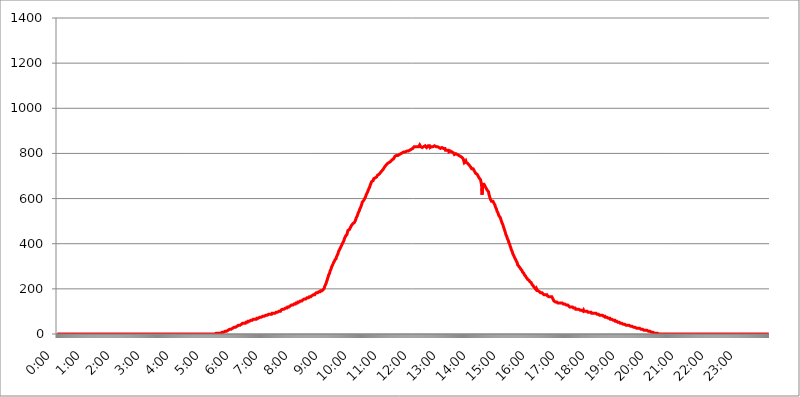
| Category | 2017.08.01. Intenzitás [W/m^2] |
|---|---|
| 0.0 | 0 |
| 0.0006944444444444445 | 0 |
| 0.001388888888888889 | 0 |
| 0.0020833333333333333 | 0 |
| 0.002777777777777778 | 0 |
| 0.003472222222222222 | 0 |
| 0.004166666666666667 | 0 |
| 0.004861111111111111 | 0 |
| 0.005555555555555556 | 0 |
| 0.0062499999999999995 | 0 |
| 0.006944444444444444 | 0 |
| 0.007638888888888889 | 0 |
| 0.008333333333333333 | 0 |
| 0.009027777777777779 | 0 |
| 0.009722222222222222 | 0 |
| 0.010416666666666666 | 0 |
| 0.011111111111111112 | 0 |
| 0.011805555555555555 | 0 |
| 0.012499999999999999 | 0 |
| 0.013194444444444444 | 0 |
| 0.013888888888888888 | 0 |
| 0.014583333333333332 | 0 |
| 0.015277777777777777 | 0 |
| 0.015972222222222224 | 0 |
| 0.016666666666666666 | 0 |
| 0.017361111111111112 | 0 |
| 0.018055555555555557 | 0 |
| 0.01875 | 0 |
| 0.019444444444444445 | 0 |
| 0.02013888888888889 | 0 |
| 0.020833333333333332 | 0 |
| 0.02152777777777778 | 0 |
| 0.022222222222222223 | 0 |
| 0.02291666666666667 | 0 |
| 0.02361111111111111 | 0 |
| 0.024305555555555556 | 0 |
| 0.024999999999999998 | 0 |
| 0.025694444444444447 | 0 |
| 0.02638888888888889 | 0 |
| 0.027083333333333334 | 0 |
| 0.027777777777777776 | 0 |
| 0.02847222222222222 | 0 |
| 0.029166666666666664 | 0 |
| 0.029861111111111113 | 0 |
| 0.030555555555555555 | 0 |
| 0.03125 | 0 |
| 0.03194444444444445 | 0 |
| 0.03263888888888889 | 0 |
| 0.03333333333333333 | 0 |
| 0.034027777777777775 | 0 |
| 0.034722222222222224 | 0 |
| 0.035416666666666666 | 0 |
| 0.036111111111111115 | 0 |
| 0.03680555555555556 | 0 |
| 0.0375 | 0 |
| 0.03819444444444444 | 0 |
| 0.03888888888888889 | 0 |
| 0.03958333333333333 | 0 |
| 0.04027777777777778 | 0 |
| 0.04097222222222222 | 0 |
| 0.041666666666666664 | 0 |
| 0.042361111111111106 | 0 |
| 0.04305555555555556 | 0 |
| 0.043750000000000004 | 0 |
| 0.044444444444444446 | 0 |
| 0.04513888888888889 | 0 |
| 0.04583333333333334 | 0 |
| 0.04652777777777778 | 0 |
| 0.04722222222222222 | 0 |
| 0.04791666666666666 | 0 |
| 0.04861111111111111 | 0 |
| 0.049305555555555554 | 0 |
| 0.049999999999999996 | 0 |
| 0.05069444444444445 | 0 |
| 0.051388888888888894 | 0 |
| 0.052083333333333336 | 0 |
| 0.05277777777777778 | 0 |
| 0.05347222222222222 | 0 |
| 0.05416666666666667 | 0 |
| 0.05486111111111111 | 0 |
| 0.05555555555555555 | 0 |
| 0.05625 | 0 |
| 0.05694444444444444 | 0 |
| 0.057638888888888885 | 0 |
| 0.05833333333333333 | 0 |
| 0.05902777777777778 | 0 |
| 0.059722222222222225 | 0 |
| 0.06041666666666667 | 0 |
| 0.061111111111111116 | 0 |
| 0.06180555555555556 | 0 |
| 0.0625 | 0 |
| 0.06319444444444444 | 0 |
| 0.06388888888888888 | 0 |
| 0.06458333333333334 | 0 |
| 0.06527777777777778 | 0 |
| 0.06597222222222222 | 0 |
| 0.06666666666666667 | 0 |
| 0.06736111111111111 | 0 |
| 0.06805555555555555 | 0 |
| 0.06874999999999999 | 0 |
| 0.06944444444444443 | 0 |
| 0.07013888888888889 | 0 |
| 0.07083333333333333 | 0 |
| 0.07152777777777779 | 0 |
| 0.07222222222222223 | 0 |
| 0.07291666666666667 | 0 |
| 0.07361111111111111 | 0 |
| 0.07430555555555556 | 0 |
| 0.075 | 0 |
| 0.07569444444444444 | 0 |
| 0.0763888888888889 | 0 |
| 0.07708333333333334 | 0 |
| 0.07777777777777778 | 0 |
| 0.07847222222222222 | 0 |
| 0.07916666666666666 | 0 |
| 0.0798611111111111 | 0 |
| 0.08055555555555556 | 0 |
| 0.08125 | 0 |
| 0.08194444444444444 | 0 |
| 0.08263888888888889 | 0 |
| 0.08333333333333333 | 0 |
| 0.08402777777777777 | 0 |
| 0.08472222222222221 | 0 |
| 0.08541666666666665 | 0 |
| 0.08611111111111112 | 0 |
| 0.08680555555555557 | 0 |
| 0.08750000000000001 | 0 |
| 0.08819444444444445 | 0 |
| 0.08888888888888889 | 0 |
| 0.08958333333333333 | 0 |
| 0.09027777777777778 | 0 |
| 0.09097222222222222 | 0 |
| 0.09166666666666667 | 0 |
| 0.09236111111111112 | 0 |
| 0.09305555555555556 | 0 |
| 0.09375 | 0 |
| 0.09444444444444444 | 0 |
| 0.09513888888888888 | 0 |
| 0.09583333333333333 | 0 |
| 0.09652777777777777 | 0 |
| 0.09722222222222222 | 0 |
| 0.09791666666666667 | 0 |
| 0.09861111111111111 | 0 |
| 0.09930555555555555 | 0 |
| 0.09999999999999999 | 0 |
| 0.10069444444444443 | 0 |
| 0.1013888888888889 | 0 |
| 0.10208333333333335 | 0 |
| 0.10277777777777779 | 0 |
| 0.10347222222222223 | 0 |
| 0.10416666666666667 | 0 |
| 0.10486111111111111 | 0 |
| 0.10555555555555556 | 0 |
| 0.10625 | 0 |
| 0.10694444444444444 | 0 |
| 0.1076388888888889 | 0 |
| 0.10833333333333334 | 0 |
| 0.10902777777777778 | 0 |
| 0.10972222222222222 | 0 |
| 0.1111111111111111 | 0 |
| 0.11180555555555556 | 0 |
| 0.11180555555555556 | 0 |
| 0.1125 | 0 |
| 0.11319444444444444 | 0 |
| 0.11388888888888889 | 0 |
| 0.11458333333333333 | 0 |
| 0.11527777777777777 | 0 |
| 0.11597222222222221 | 0 |
| 0.11666666666666665 | 0 |
| 0.1173611111111111 | 0 |
| 0.11805555555555557 | 0 |
| 0.11944444444444445 | 0 |
| 0.12013888888888889 | 0 |
| 0.12083333333333333 | 0 |
| 0.12152777777777778 | 0 |
| 0.12222222222222223 | 0 |
| 0.12291666666666667 | 0 |
| 0.12291666666666667 | 0 |
| 0.12361111111111112 | 0 |
| 0.12430555555555556 | 0 |
| 0.125 | 0 |
| 0.12569444444444444 | 0 |
| 0.12638888888888888 | 0 |
| 0.12708333333333333 | 0 |
| 0.16875 | 0 |
| 0.12847222222222224 | 0 |
| 0.12916666666666668 | 0 |
| 0.12986111111111112 | 0 |
| 0.13055555555555556 | 0 |
| 0.13125 | 0 |
| 0.13194444444444445 | 0 |
| 0.1326388888888889 | 0 |
| 0.13333333333333333 | 0 |
| 0.13402777777777777 | 0 |
| 0.13402777777777777 | 0 |
| 0.13472222222222222 | 0 |
| 0.13541666666666666 | 0 |
| 0.1361111111111111 | 0 |
| 0.13749999999999998 | 0 |
| 0.13819444444444443 | 0 |
| 0.1388888888888889 | 0 |
| 0.13958333333333334 | 0 |
| 0.14027777777777778 | 0 |
| 0.14097222222222222 | 0 |
| 0.14166666666666666 | 0 |
| 0.1423611111111111 | 0 |
| 0.14305555555555557 | 0 |
| 0.14375000000000002 | 0 |
| 0.14444444444444446 | 0 |
| 0.1451388888888889 | 0 |
| 0.1451388888888889 | 0 |
| 0.14652777777777778 | 0 |
| 0.14722222222222223 | 0 |
| 0.14791666666666667 | 0 |
| 0.1486111111111111 | 0 |
| 0.14930555555555555 | 0 |
| 0.15 | 0 |
| 0.15069444444444444 | 0 |
| 0.15138888888888888 | 0 |
| 0.15208333333333332 | 0 |
| 0.15277777777777776 | 0 |
| 0.15347222222222223 | 0 |
| 0.15416666666666667 | 0 |
| 0.15486111111111112 | 0 |
| 0.15555555555555556 | 0 |
| 0.15625 | 0 |
| 0.15694444444444444 | 0 |
| 0.15763888888888888 | 0 |
| 0.15833333333333333 | 0 |
| 0.15902777777777777 | 0 |
| 0.15972222222222224 | 0 |
| 0.16041666666666668 | 0 |
| 0.16111111111111112 | 0 |
| 0.16180555555555556 | 0 |
| 0.1625 | 0 |
| 0.16319444444444445 | 0 |
| 0.1638888888888889 | 0 |
| 0.16458333333333333 | 0 |
| 0.16527777777777777 | 0 |
| 0.16597222222222222 | 0 |
| 0.16666666666666666 | 0 |
| 0.1673611111111111 | 0 |
| 0.16805555555555554 | 0 |
| 0.16874999999999998 | 0 |
| 0.16944444444444443 | 0 |
| 0.17013888888888887 | 0 |
| 0.1708333333333333 | 0 |
| 0.17152777777777775 | 0 |
| 0.17222222222222225 | 0 |
| 0.1729166666666667 | 0 |
| 0.17361111111111113 | 0 |
| 0.17430555555555557 | 0 |
| 0.17500000000000002 | 0 |
| 0.17569444444444446 | 0 |
| 0.1763888888888889 | 0 |
| 0.17708333333333334 | 0 |
| 0.17777777777777778 | 0 |
| 0.17847222222222223 | 0 |
| 0.17916666666666667 | 0 |
| 0.1798611111111111 | 0 |
| 0.18055555555555555 | 0 |
| 0.18125 | 0 |
| 0.18194444444444444 | 0 |
| 0.1826388888888889 | 0 |
| 0.18333333333333335 | 0 |
| 0.1840277777777778 | 0 |
| 0.18472222222222223 | 0 |
| 0.18541666666666667 | 0 |
| 0.18611111111111112 | 0 |
| 0.18680555555555556 | 0 |
| 0.1875 | 0 |
| 0.18819444444444444 | 0 |
| 0.18888888888888888 | 0 |
| 0.18958333333333333 | 0 |
| 0.19027777777777777 | 0 |
| 0.1909722222222222 | 0 |
| 0.19166666666666665 | 0 |
| 0.19236111111111112 | 0 |
| 0.19305555555555554 | 0 |
| 0.19375 | 0 |
| 0.19444444444444445 | 0 |
| 0.1951388888888889 | 0 |
| 0.19583333333333333 | 0 |
| 0.19652777777777777 | 0 |
| 0.19722222222222222 | 0 |
| 0.19791666666666666 | 0 |
| 0.1986111111111111 | 0 |
| 0.19930555555555554 | 0 |
| 0.19999999999999998 | 0 |
| 0.20069444444444443 | 0 |
| 0.20138888888888887 | 0 |
| 0.2020833333333333 | 0 |
| 0.2027777777777778 | 0 |
| 0.2034722222222222 | 0 |
| 0.2041666666666667 | 0 |
| 0.20486111111111113 | 0 |
| 0.20555555555555557 | 0 |
| 0.20625000000000002 | 0 |
| 0.20694444444444446 | 0 |
| 0.2076388888888889 | 0 |
| 0.20833333333333334 | 0 |
| 0.20902777777777778 | 0 |
| 0.20972222222222223 | 0 |
| 0.21041666666666667 | 0 |
| 0.2111111111111111 | 0 |
| 0.21180555555555555 | 0 |
| 0.2125 | 0 |
| 0.21319444444444444 | 0 |
| 0.2138888888888889 | 0 |
| 0.21458333333333335 | 0 |
| 0.2152777777777778 | 0 |
| 0.21597222222222223 | 0 |
| 0.21666666666666667 | 0 |
| 0.21736111111111112 | 0 |
| 0.21805555555555556 | 0 |
| 0.21875 | 0 |
| 0.21944444444444444 | 0 |
| 0.22013888888888888 | 0 |
| 0.22083333333333333 | 0 |
| 0.22152777777777777 | 0 |
| 0.2222222222222222 | 0 |
| 0.22291666666666665 | 3.525 |
| 0.2236111111111111 | 3.525 |
| 0.22430555555555556 | 3.525 |
| 0.225 | 3.525 |
| 0.22569444444444445 | 3.525 |
| 0.2263888888888889 | 3.525 |
| 0.22708333333333333 | 3.525 |
| 0.22777777777777777 | 3.525 |
| 0.22847222222222222 | 3.525 |
| 0.22916666666666666 | 3.525 |
| 0.2298611111111111 | 3.525 |
| 0.23055555555555554 | 3.525 |
| 0.23124999999999998 | 7.887 |
| 0.23194444444444443 | 7.887 |
| 0.23263888888888887 | 7.887 |
| 0.2333333333333333 | 7.887 |
| 0.2340277777777778 | 7.887 |
| 0.2347222222222222 | 12.257 |
| 0.2354166666666667 | 12.257 |
| 0.23611111111111113 | 12.257 |
| 0.23680555555555557 | 12.257 |
| 0.23750000000000002 | 12.257 |
| 0.23819444444444446 | 12.257 |
| 0.2388888888888889 | 16.636 |
| 0.23958333333333334 | 16.636 |
| 0.24027777777777778 | 16.636 |
| 0.24097222222222223 | 21.024 |
| 0.24166666666666667 | 21.024 |
| 0.2423611111111111 | 21.024 |
| 0.24305555555555555 | 21.024 |
| 0.24375 | 21.024 |
| 0.24444444444444446 | 25.419 |
| 0.24513888888888888 | 25.419 |
| 0.24583333333333335 | 25.419 |
| 0.2465277777777778 | 25.419 |
| 0.24722222222222223 | 25.419 |
| 0.24791666666666667 | 29.823 |
| 0.24861111111111112 | 29.823 |
| 0.24930555555555556 | 29.823 |
| 0.25 | 29.823 |
| 0.25069444444444444 | 29.823 |
| 0.2513888888888889 | 34.234 |
| 0.2520833333333333 | 34.234 |
| 0.25277777777777777 | 34.234 |
| 0.2534722222222222 | 34.234 |
| 0.25416666666666665 | 38.653 |
| 0.2548611111111111 | 38.653 |
| 0.2555555555555556 | 38.653 |
| 0.25625000000000003 | 38.653 |
| 0.2569444444444445 | 43.079 |
| 0.2576388888888889 | 43.079 |
| 0.25833333333333336 | 43.079 |
| 0.2590277777777778 | 43.079 |
| 0.25972222222222224 | 47.511 |
| 0.2604166666666667 | 47.511 |
| 0.2611111111111111 | 47.511 |
| 0.26180555555555557 | 47.511 |
| 0.2625 | 47.511 |
| 0.26319444444444445 | 47.511 |
| 0.2638888888888889 | 47.511 |
| 0.26458333333333334 | 51.951 |
| 0.2652777777777778 | 51.951 |
| 0.2659722222222222 | 51.951 |
| 0.26666666666666666 | 51.951 |
| 0.2673611111111111 | 56.398 |
| 0.26805555555555555 | 56.398 |
| 0.26875 | 56.398 |
| 0.26944444444444443 | 56.398 |
| 0.2701388888888889 | 56.398 |
| 0.2708333333333333 | 56.398 |
| 0.27152777777777776 | 60.85 |
| 0.2722222222222222 | 60.85 |
| 0.27291666666666664 | 60.85 |
| 0.2736111111111111 | 60.85 |
| 0.2743055555555555 | 60.85 |
| 0.27499999999999997 | 65.31 |
| 0.27569444444444446 | 65.31 |
| 0.27638888888888885 | 65.31 |
| 0.27708333333333335 | 65.31 |
| 0.2777777777777778 | 65.31 |
| 0.27847222222222223 | 65.31 |
| 0.2791666666666667 | 65.31 |
| 0.2798611111111111 | 69.775 |
| 0.28055555555555556 | 69.775 |
| 0.28125 | 69.775 |
| 0.28194444444444444 | 69.775 |
| 0.2826388888888889 | 69.775 |
| 0.2833333333333333 | 69.775 |
| 0.28402777777777777 | 74.246 |
| 0.2847222222222222 | 74.246 |
| 0.28541666666666665 | 74.246 |
| 0.28611111111111115 | 74.246 |
| 0.28680555555555554 | 74.246 |
| 0.28750000000000003 | 74.246 |
| 0.2881944444444445 | 78.722 |
| 0.2888888888888889 | 78.722 |
| 0.28958333333333336 | 78.722 |
| 0.2902777777777778 | 78.722 |
| 0.29097222222222224 | 78.722 |
| 0.2916666666666667 | 78.722 |
| 0.2923611111111111 | 83.205 |
| 0.29305555555555557 | 83.205 |
| 0.29375 | 83.205 |
| 0.29444444444444445 | 83.205 |
| 0.2951388888888889 | 83.205 |
| 0.29583333333333334 | 83.205 |
| 0.2965277777777778 | 87.692 |
| 0.2972222222222222 | 87.692 |
| 0.29791666666666666 | 87.692 |
| 0.2986111111111111 | 87.692 |
| 0.29930555555555555 | 87.692 |
| 0.3 | 87.692 |
| 0.30069444444444443 | 87.692 |
| 0.3013888888888889 | 92.184 |
| 0.3020833333333333 | 92.184 |
| 0.30277777777777776 | 92.184 |
| 0.3034722222222222 | 92.184 |
| 0.30416666666666664 | 92.184 |
| 0.3048611111111111 | 92.184 |
| 0.3055555555555555 | 92.184 |
| 0.30624999999999997 | 92.184 |
| 0.3069444444444444 | 96.682 |
| 0.3076388888888889 | 96.682 |
| 0.30833333333333335 | 96.682 |
| 0.3090277777777778 | 96.682 |
| 0.30972222222222223 | 96.682 |
| 0.3104166666666667 | 96.682 |
| 0.3111111111111111 | 101.184 |
| 0.31180555555555556 | 101.184 |
| 0.3125 | 101.184 |
| 0.31319444444444444 | 101.184 |
| 0.3138888888888889 | 105.69 |
| 0.3145833333333333 | 105.69 |
| 0.31527777777777777 | 105.69 |
| 0.3159722222222222 | 110.201 |
| 0.31666666666666665 | 110.201 |
| 0.31736111111111115 | 110.201 |
| 0.31805555555555554 | 110.201 |
| 0.31875000000000003 | 110.201 |
| 0.3194444444444445 | 110.201 |
| 0.3201388888888889 | 114.716 |
| 0.32083333333333336 | 114.716 |
| 0.3215277777777778 | 114.716 |
| 0.32222222222222224 | 114.716 |
| 0.3229166666666667 | 119.235 |
| 0.3236111111111111 | 119.235 |
| 0.32430555555555557 | 119.235 |
| 0.325 | 119.235 |
| 0.32569444444444445 | 119.235 |
| 0.3263888888888889 | 123.758 |
| 0.32708333333333334 | 123.758 |
| 0.3277777777777778 | 123.758 |
| 0.3284722222222222 | 128.284 |
| 0.32916666666666666 | 128.284 |
| 0.3298611111111111 | 128.284 |
| 0.33055555555555555 | 128.284 |
| 0.33125 | 128.284 |
| 0.33194444444444443 | 132.814 |
| 0.3326388888888889 | 132.814 |
| 0.3333333333333333 | 132.814 |
| 0.3340277777777778 | 132.814 |
| 0.3347222222222222 | 137.347 |
| 0.3354166666666667 | 137.347 |
| 0.3361111111111111 | 137.347 |
| 0.3368055555555556 | 137.347 |
| 0.33749999999999997 | 141.884 |
| 0.33819444444444446 | 141.884 |
| 0.33888888888888885 | 141.884 |
| 0.33958333333333335 | 141.884 |
| 0.34027777777777773 | 141.884 |
| 0.34097222222222223 | 146.423 |
| 0.3416666666666666 | 146.423 |
| 0.3423611111111111 | 146.423 |
| 0.3430555555555555 | 146.423 |
| 0.34375 | 146.423 |
| 0.3444444444444445 | 150.964 |
| 0.3451388888888889 | 150.964 |
| 0.3458333333333334 | 150.964 |
| 0.34652777777777777 | 155.509 |
| 0.34722222222222227 | 155.509 |
| 0.34791666666666665 | 155.509 |
| 0.34861111111111115 | 155.509 |
| 0.34930555555555554 | 155.509 |
| 0.35000000000000003 | 160.056 |
| 0.3506944444444444 | 160.056 |
| 0.3513888888888889 | 160.056 |
| 0.3520833333333333 | 160.056 |
| 0.3527777777777778 | 160.056 |
| 0.3534722222222222 | 164.605 |
| 0.3541666666666667 | 164.605 |
| 0.3548611111111111 | 164.605 |
| 0.35555555555555557 | 164.605 |
| 0.35625 | 164.605 |
| 0.35694444444444445 | 169.156 |
| 0.3576388888888889 | 169.156 |
| 0.35833333333333334 | 169.156 |
| 0.3590277777777778 | 173.709 |
| 0.3597222222222222 | 173.709 |
| 0.36041666666666666 | 173.709 |
| 0.3611111111111111 | 173.709 |
| 0.36180555555555555 | 178.264 |
| 0.3625 | 178.264 |
| 0.36319444444444443 | 182.82 |
| 0.3638888888888889 | 182.82 |
| 0.3645833333333333 | 182.82 |
| 0.3652777777777778 | 182.82 |
| 0.3659722222222222 | 182.82 |
| 0.3666666666666667 | 187.378 |
| 0.3673611111111111 | 187.378 |
| 0.3680555555555556 | 187.378 |
| 0.36874999999999997 | 187.378 |
| 0.36944444444444446 | 191.937 |
| 0.37013888888888885 | 191.937 |
| 0.37083333333333335 | 191.937 |
| 0.37152777777777773 | 191.937 |
| 0.37222222222222223 | 191.937 |
| 0.3729166666666666 | 196.497 |
| 0.3736111111111111 | 196.497 |
| 0.3743055555555555 | 201.058 |
| 0.375 | 210.182 |
| 0.3756944444444445 | 214.746 |
| 0.3763888888888889 | 219.309 |
| 0.3770833333333334 | 223.873 |
| 0.37777777777777777 | 233 |
| 0.37847222222222227 | 237.564 |
| 0.37916666666666665 | 246.689 |
| 0.37986111111111115 | 251.251 |
| 0.38055555555555554 | 260.373 |
| 0.38125000000000003 | 264.932 |
| 0.3819444444444444 | 269.49 |
| 0.3826388888888889 | 278.603 |
| 0.3833333333333333 | 283.156 |
| 0.3840277777777778 | 287.709 |
| 0.3847222222222222 | 296.808 |
| 0.3854166666666667 | 301.354 |
| 0.3861111111111111 | 305.898 |
| 0.38680555555555557 | 310.44 |
| 0.3875 | 314.98 |
| 0.38819444444444445 | 319.517 |
| 0.3888888888888889 | 324.052 |
| 0.38958333333333334 | 328.584 |
| 0.3902777777777778 | 328.584 |
| 0.3909722222222222 | 333.113 |
| 0.39166666666666666 | 342.162 |
| 0.3923611111111111 | 342.162 |
| 0.39305555555555555 | 351.198 |
| 0.39375 | 355.712 |
| 0.39444444444444443 | 364.728 |
| 0.3951388888888889 | 369.23 |
| 0.3958333333333333 | 373.729 |
| 0.3965277777777778 | 378.224 |
| 0.3972222222222222 | 382.715 |
| 0.3979166666666667 | 387.202 |
| 0.3986111111111111 | 387.202 |
| 0.3993055555555556 | 396.164 |
| 0.39999999999999997 | 400.638 |
| 0.40069444444444446 | 405.108 |
| 0.40138888888888885 | 409.574 |
| 0.40208333333333335 | 414.035 |
| 0.40277777777777773 | 422.943 |
| 0.40347222222222223 | 427.39 |
| 0.4041666666666666 | 431.833 |
| 0.4048611111111111 | 436.27 |
| 0.4055555555555555 | 436.27 |
| 0.40625 | 440.702 |
| 0.4069444444444445 | 449.551 |
| 0.4076388888888889 | 458.38 |
| 0.4083333333333334 | 458.38 |
| 0.40902777777777777 | 462.786 |
| 0.40972222222222227 | 462.786 |
| 0.41041666666666665 | 467.187 |
| 0.41111111111111115 | 471.582 |
| 0.41180555555555554 | 475.972 |
| 0.41250000000000003 | 480.356 |
| 0.4131944444444444 | 480.356 |
| 0.4138888888888889 | 484.735 |
| 0.4145833333333333 | 489.108 |
| 0.4152777777777778 | 489.108 |
| 0.4159722222222222 | 489.108 |
| 0.4166666666666667 | 493.475 |
| 0.4173611111111111 | 497.836 |
| 0.41805555555555557 | 502.192 |
| 0.41875 | 506.542 |
| 0.41944444444444445 | 515.223 |
| 0.4201388888888889 | 519.555 |
| 0.42083333333333334 | 523.88 |
| 0.4215277777777778 | 528.2 |
| 0.4222222222222222 | 536.82 |
| 0.42291666666666666 | 541.121 |
| 0.4236111111111111 | 545.416 |
| 0.42430555555555555 | 553.986 |
| 0.425 | 558.261 |
| 0.42569444444444443 | 562.53 |
| 0.4263888888888889 | 566.793 |
| 0.4270833333333333 | 575.299 |
| 0.4277777777777778 | 583.779 |
| 0.4284722222222222 | 583.779 |
| 0.4291666666666667 | 588.009 |
| 0.4298611111111111 | 592.233 |
| 0.4305555555555556 | 592.233 |
| 0.43124999999999997 | 600.661 |
| 0.43194444444444446 | 600.661 |
| 0.43263888888888885 | 609.062 |
| 0.43333333333333335 | 617.436 |
| 0.43402777777777773 | 617.436 |
| 0.43472222222222223 | 621.613 |
| 0.4354166666666666 | 629.948 |
| 0.4361111111111111 | 634.105 |
| 0.4368055555555555 | 642.4 |
| 0.4375 | 646.537 |
| 0.4381944444444445 | 650.667 |
| 0.4388888888888889 | 658.909 |
| 0.4395833333333334 | 663.019 |
| 0.44027777777777777 | 663.019 |
| 0.44097222222222227 | 675.311 |
| 0.44166666666666665 | 675.311 |
| 0.44236111111111115 | 679.395 |
| 0.44305555555555554 | 679.395 |
| 0.44375000000000003 | 687.544 |
| 0.4444444444444444 | 687.544 |
| 0.4451388888888889 | 687.544 |
| 0.4458333333333333 | 691.608 |
| 0.4465277777777778 | 691.608 |
| 0.4472222222222222 | 695.666 |
| 0.4479166666666667 | 695.666 |
| 0.4486111111111111 | 699.717 |
| 0.44930555555555557 | 703.762 |
| 0.45 | 703.762 |
| 0.45069444444444445 | 703.762 |
| 0.4513888888888889 | 707.8 |
| 0.45208333333333334 | 711.832 |
| 0.4527777777777778 | 711.832 |
| 0.4534722222222222 | 715.858 |
| 0.45416666666666666 | 719.877 |
| 0.4548611111111111 | 719.877 |
| 0.45555555555555555 | 723.889 |
| 0.45625 | 727.896 |
| 0.45694444444444443 | 727.896 |
| 0.4576388888888889 | 731.896 |
| 0.4583333333333333 | 735.89 |
| 0.4590277777777778 | 739.877 |
| 0.4597222222222222 | 739.877 |
| 0.4604166666666667 | 743.859 |
| 0.4611111111111111 | 747.834 |
| 0.4618055555555556 | 747.834 |
| 0.46249999999999997 | 751.803 |
| 0.46319444444444446 | 755.766 |
| 0.46388888888888885 | 751.803 |
| 0.46458333333333335 | 759.723 |
| 0.46527777777777773 | 759.723 |
| 0.46597222222222223 | 759.723 |
| 0.4666666666666666 | 763.674 |
| 0.4673611111111111 | 763.674 |
| 0.4680555555555555 | 767.62 |
| 0.46875 | 767.62 |
| 0.4694444444444445 | 771.559 |
| 0.4701388888888889 | 775.492 |
| 0.4708333333333334 | 775.492 |
| 0.47152777777777777 | 775.492 |
| 0.47222222222222227 | 779.42 |
| 0.47291666666666665 | 779.42 |
| 0.47361111111111115 | 787.258 |
| 0.47430555555555554 | 787.258 |
| 0.47500000000000003 | 783.342 |
| 0.4756944444444444 | 791.169 |
| 0.4763888888888889 | 791.169 |
| 0.4770833333333333 | 791.169 |
| 0.4777777777777778 | 791.169 |
| 0.4784722222222222 | 791.169 |
| 0.4791666666666667 | 791.169 |
| 0.4798611111111111 | 795.074 |
| 0.48055555555555557 | 795.074 |
| 0.48125 | 798.974 |
| 0.48194444444444445 | 798.974 |
| 0.4826388888888889 | 802.868 |
| 0.48333333333333334 | 802.868 |
| 0.4840277777777778 | 802.868 |
| 0.4847222222222222 | 802.868 |
| 0.48541666666666666 | 802.868 |
| 0.4861111111111111 | 806.757 |
| 0.48680555555555555 | 802.868 |
| 0.4875 | 806.757 |
| 0.48819444444444443 | 806.757 |
| 0.4888888888888889 | 806.757 |
| 0.4895833333333333 | 806.757 |
| 0.4902777777777778 | 810.641 |
| 0.4909722222222222 | 806.757 |
| 0.4916666666666667 | 810.641 |
| 0.4923611111111111 | 810.641 |
| 0.4930555555555556 | 810.641 |
| 0.49374999999999997 | 810.641 |
| 0.49444444444444446 | 814.519 |
| 0.49513888888888885 | 814.519 |
| 0.49583333333333335 | 814.519 |
| 0.49652777777777773 | 818.392 |
| 0.49722222222222223 | 822.26 |
| 0.4979166666666666 | 822.26 |
| 0.4986111111111111 | 822.26 |
| 0.4993055555555555 | 822.26 |
| 0.5 | 822.26 |
| 0.5006944444444444 | 829.981 |
| 0.5013888888888889 | 826.123 |
| 0.5020833333333333 | 829.981 |
| 0.5027777777777778 | 829.981 |
| 0.5034722222222222 | 829.981 |
| 0.5041666666666667 | 829.981 |
| 0.5048611111111111 | 829.981 |
| 0.5055555555555555 | 829.981 |
| 0.50625 | 829.981 |
| 0.5069444444444444 | 829.981 |
| 0.5076388888888889 | 829.981 |
| 0.5083333333333333 | 837.682 |
| 0.5090277777777777 | 833.834 |
| 0.5097222222222222 | 829.981 |
| 0.5104166666666666 | 829.981 |
| 0.5111111111111112 | 829.981 |
| 0.5118055555555555 | 826.123 |
| 0.5125000000000001 | 829.981 |
| 0.5131944444444444 | 829.981 |
| 0.513888888888889 | 829.981 |
| 0.5145833333333333 | 829.981 |
| 0.5152777777777778 | 833.834 |
| 0.5159722222222222 | 833.834 |
| 0.5166666666666667 | 829.981 |
| 0.517361111111111 | 829.981 |
| 0.5180555555555556 | 826.123 |
| 0.5187499999999999 | 829.981 |
| 0.5194444444444445 | 829.981 |
| 0.5201388888888888 | 833.834 |
| 0.5208333333333334 | 833.834 |
| 0.5215277777777778 | 833.834 |
| 0.5222222222222223 | 833.834 |
| 0.5229166666666667 | 826.123 |
| 0.5236111111111111 | 826.123 |
| 0.5243055555555556 | 829.981 |
| 0.525 | 829.981 |
| 0.5256944444444445 | 829.981 |
| 0.5263888888888889 | 833.834 |
| 0.5270833333333333 | 829.981 |
| 0.5277777777777778 | 829.981 |
| 0.5284722222222222 | 833.834 |
| 0.5291666666666667 | 833.834 |
| 0.5298611111111111 | 829.981 |
| 0.5305555555555556 | 829.981 |
| 0.53125 | 829.981 |
| 0.5319444444444444 | 829.981 |
| 0.5326388888888889 | 829.981 |
| 0.5333333333333333 | 829.981 |
| 0.5340277777777778 | 826.123 |
| 0.5347222222222222 | 829.981 |
| 0.5354166666666667 | 826.123 |
| 0.5361111111111111 | 822.26 |
| 0.5368055555555555 | 826.123 |
| 0.5375 | 822.26 |
| 0.5381944444444444 | 822.26 |
| 0.5388888888888889 | 826.123 |
| 0.5395833333333333 | 826.123 |
| 0.5402777777777777 | 826.123 |
| 0.5409722222222222 | 826.123 |
| 0.5416666666666666 | 822.26 |
| 0.5423611111111112 | 822.26 |
| 0.5430555555555555 | 822.26 |
| 0.5437500000000001 | 822.26 |
| 0.5444444444444444 | 814.519 |
| 0.545138888888889 | 814.519 |
| 0.5458333333333333 | 810.641 |
| 0.5465277777777778 | 814.519 |
| 0.5472222222222222 | 814.519 |
| 0.5479166666666667 | 814.519 |
| 0.548611111111111 | 814.519 |
| 0.5493055555555556 | 806.757 |
| 0.5499999999999999 | 806.757 |
| 0.5506944444444445 | 810.641 |
| 0.5513888888888888 | 810.641 |
| 0.5520833333333334 | 806.757 |
| 0.5527777777777778 | 806.757 |
| 0.5534722222222223 | 806.757 |
| 0.5541666666666667 | 806.757 |
| 0.5548611111111111 | 802.868 |
| 0.5555555555555556 | 802.868 |
| 0.55625 | 798.974 |
| 0.5569444444444445 | 795.074 |
| 0.5576388888888889 | 795.074 |
| 0.5583333333333333 | 798.974 |
| 0.5590277777777778 | 798.974 |
| 0.5597222222222222 | 798.974 |
| 0.5604166666666667 | 795.074 |
| 0.5611111111111111 | 795.074 |
| 0.5618055555555556 | 791.169 |
| 0.5625 | 791.169 |
| 0.5631944444444444 | 791.169 |
| 0.5638888888888889 | 791.169 |
| 0.5645833333333333 | 787.258 |
| 0.5652777777777778 | 787.258 |
| 0.5659722222222222 | 787.258 |
| 0.5666666666666667 | 783.342 |
| 0.5673611111111111 | 783.342 |
| 0.5680555555555555 | 779.42 |
| 0.56875 | 779.42 |
| 0.5694444444444444 | 775.492 |
| 0.5701388888888889 | 771.559 |
| 0.5708333333333333 | 759.723 |
| 0.5715277777777777 | 763.674 |
| 0.5722222222222222 | 763.674 |
| 0.5729166666666666 | 767.62 |
| 0.5736111111111112 | 759.723 |
| 0.5743055555555555 | 763.674 |
| 0.5750000000000001 | 759.723 |
| 0.5756944444444444 | 755.766 |
| 0.576388888888889 | 751.803 |
| 0.5770833333333333 | 751.803 |
| 0.5777777777777778 | 747.834 |
| 0.5784722222222222 | 743.859 |
| 0.5791666666666667 | 743.859 |
| 0.579861111111111 | 739.877 |
| 0.5805555555555556 | 735.89 |
| 0.5812499999999999 | 731.896 |
| 0.5819444444444445 | 731.896 |
| 0.5826388888888888 | 735.89 |
| 0.5833333333333334 | 731.896 |
| 0.5840277777777778 | 727.896 |
| 0.5847222222222223 | 723.889 |
| 0.5854166666666667 | 719.877 |
| 0.5861111111111111 | 719.877 |
| 0.5868055555555556 | 711.832 |
| 0.5875 | 711.832 |
| 0.5881944444444445 | 711.832 |
| 0.5888888888888889 | 707.8 |
| 0.5895833333333333 | 707.8 |
| 0.5902777777777778 | 699.717 |
| 0.5909722222222222 | 703.762 |
| 0.5916666666666667 | 691.608 |
| 0.5923611111111111 | 687.544 |
| 0.5930555555555556 | 687.544 |
| 0.59375 | 683.473 |
| 0.5944444444444444 | 679.395 |
| 0.5951388888888889 | 658.909 |
| 0.5958333333333333 | 617.436 |
| 0.5965277777777778 | 663.019 |
| 0.5972222222222222 | 663.019 |
| 0.5979166666666667 | 667.123 |
| 0.5986111111111111 | 663.019 |
| 0.5993055555555555 | 658.909 |
| 0.6 | 654.791 |
| 0.6006944444444444 | 650.667 |
| 0.6013888888888889 | 646.537 |
| 0.6020833333333333 | 642.4 |
| 0.6027777777777777 | 638.256 |
| 0.6034722222222222 | 634.105 |
| 0.6041666666666666 | 634.105 |
| 0.6048611111111112 | 629.948 |
| 0.6055555555555555 | 617.436 |
| 0.6062500000000001 | 617.436 |
| 0.6069444444444444 | 613.252 |
| 0.607638888888889 | 596.45 |
| 0.6083333333333333 | 592.233 |
| 0.6090277777777778 | 588.009 |
| 0.6097222222222222 | 588.009 |
| 0.6104166666666667 | 592.233 |
| 0.611111111111111 | 588.009 |
| 0.6118055555555556 | 583.779 |
| 0.6124999999999999 | 579.542 |
| 0.6131944444444445 | 575.299 |
| 0.6138888888888888 | 571.049 |
| 0.6145833333333334 | 562.53 |
| 0.6152777777777778 | 558.261 |
| 0.6159722222222223 | 553.986 |
| 0.6166666666666667 | 545.416 |
| 0.6173611111111111 | 541.121 |
| 0.6180555555555556 | 536.82 |
| 0.61875 | 532.513 |
| 0.6194444444444445 | 523.88 |
| 0.6201388888888889 | 523.88 |
| 0.6208333333333333 | 519.555 |
| 0.6215277777777778 | 515.223 |
| 0.6222222222222222 | 506.542 |
| 0.6229166666666667 | 502.192 |
| 0.6236111111111111 | 493.475 |
| 0.6243055555555556 | 489.108 |
| 0.625 | 484.735 |
| 0.6256944444444444 | 475.972 |
| 0.6263888888888889 | 471.582 |
| 0.6270833333333333 | 462.786 |
| 0.6277777777777778 | 458.38 |
| 0.6284722222222222 | 449.551 |
| 0.6291666666666667 | 440.702 |
| 0.6298611111111111 | 436.27 |
| 0.6305555555555555 | 431.833 |
| 0.63125 | 422.943 |
| 0.6319444444444444 | 418.492 |
| 0.6326388888888889 | 414.035 |
| 0.6333333333333333 | 405.108 |
| 0.6340277777777777 | 400.638 |
| 0.6347222222222222 | 396.164 |
| 0.6354166666666666 | 387.202 |
| 0.6361111111111112 | 382.715 |
| 0.6368055555555555 | 373.729 |
| 0.6375000000000001 | 369.23 |
| 0.6381944444444444 | 364.728 |
| 0.638888888888889 | 355.712 |
| 0.6395833333333333 | 351.198 |
| 0.6402777777777778 | 346.682 |
| 0.6409722222222222 | 342.162 |
| 0.6416666666666667 | 337.639 |
| 0.642361111111111 | 333.113 |
| 0.6430555555555556 | 328.584 |
| 0.6437499999999999 | 324.052 |
| 0.6444444444444445 | 319.517 |
| 0.6451388888888888 | 314.98 |
| 0.6458333333333334 | 305.898 |
| 0.6465277777777778 | 305.898 |
| 0.6472222222222223 | 301.354 |
| 0.6479166666666667 | 296.808 |
| 0.6486111111111111 | 296.808 |
| 0.6493055555555556 | 292.259 |
| 0.65 | 287.709 |
| 0.6506944444444445 | 287.709 |
| 0.6513888888888889 | 283.156 |
| 0.6520833333333333 | 278.603 |
| 0.6527777777777778 | 274.047 |
| 0.6534722222222222 | 274.047 |
| 0.6541666666666667 | 269.49 |
| 0.6548611111111111 | 264.932 |
| 0.6555555555555556 | 260.373 |
| 0.65625 | 260.373 |
| 0.6569444444444444 | 255.813 |
| 0.6576388888888889 | 251.251 |
| 0.6583333333333333 | 251.251 |
| 0.6590277777777778 | 246.689 |
| 0.6597222222222222 | 242.127 |
| 0.6604166666666667 | 242.127 |
| 0.6611111111111111 | 242.127 |
| 0.6618055555555555 | 237.564 |
| 0.6625 | 233 |
| 0.6631944444444444 | 233 |
| 0.6638888888888889 | 233 |
| 0.6645833333333333 | 228.436 |
| 0.6652777777777777 | 223.873 |
| 0.6659722222222222 | 219.309 |
| 0.6666666666666666 | 219.309 |
| 0.6673611111111111 | 214.746 |
| 0.6680555555555556 | 210.182 |
| 0.6687500000000001 | 210.182 |
| 0.6694444444444444 | 205.62 |
| 0.6701388888888888 | 201.058 |
| 0.6708333333333334 | 201.058 |
| 0.6715277777777778 | 196.497 |
| 0.6722222222222222 | 201.058 |
| 0.6729166666666666 | 196.497 |
| 0.6736111111111112 | 196.497 |
| 0.6743055555555556 | 191.937 |
| 0.6749999999999999 | 191.937 |
| 0.6756944444444444 | 191.937 |
| 0.6763888888888889 | 187.378 |
| 0.6770833333333334 | 187.378 |
| 0.6777777777777777 | 182.82 |
| 0.6784722222222223 | 182.82 |
| 0.6791666666666667 | 182.82 |
| 0.6798611111111111 | 182.82 |
| 0.6805555555555555 | 182.82 |
| 0.68125 | 178.264 |
| 0.6819444444444445 | 178.264 |
| 0.6826388888888889 | 173.709 |
| 0.6833333333333332 | 173.709 |
| 0.6840277777777778 | 173.709 |
| 0.6847222222222222 | 173.709 |
| 0.6854166666666667 | 173.709 |
| 0.686111111111111 | 173.709 |
| 0.6868055555555556 | 173.709 |
| 0.6875 | 169.156 |
| 0.6881944444444444 | 169.156 |
| 0.688888888888889 | 169.156 |
| 0.6895833333333333 | 164.605 |
| 0.6902777777777778 | 164.605 |
| 0.6909722222222222 | 164.605 |
| 0.6916666666666668 | 164.605 |
| 0.6923611111111111 | 164.605 |
| 0.6930555555555555 | 164.605 |
| 0.69375 | 164.605 |
| 0.6944444444444445 | 160.056 |
| 0.6951388888888889 | 155.509 |
| 0.6958333333333333 | 150.964 |
| 0.6965277777777777 | 146.423 |
| 0.6972222222222223 | 146.423 |
| 0.6979166666666666 | 146.423 |
| 0.6986111111111111 | 141.884 |
| 0.6993055555555556 | 141.884 |
| 0.7000000000000001 | 141.884 |
| 0.7006944444444444 | 141.884 |
| 0.7013888888888888 | 141.884 |
| 0.7020833333333334 | 137.347 |
| 0.7027777777777778 | 137.347 |
| 0.7034722222222222 | 137.347 |
| 0.7041666666666666 | 137.347 |
| 0.7048611111111112 | 137.347 |
| 0.7055555555555556 | 137.347 |
| 0.7062499999999999 | 137.347 |
| 0.7069444444444444 | 137.347 |
| 0.7076388888888889 | 137.347 |
| 0.7083333333333334 | 137.347 |
| 0.7090277777777777 | 137.347 |
| 0.7097222222222223 | 132.814 |
| 0.7104166666666667 | 132.814 |
| 0.7111111111111111 | 132.814 |
| 0.7118055555555555 | 132.814 |
| 0.7125 | 132.814 |
| 0.7131944444444445 | 132.814 |
| 0.7138888888888889 | 128.284 |
| 0.7145833333333332 | 128.284 |
| 0.7152777777777778 | 128.284 |
| 0.7159722222222222 | 128.284 |
| 0.7166666666666667 | 128.284 |
| 0.717361111111111 | 123.758 |
| 0.7180555555555556 | 123.758 |
| 0.71875 | 119.235 |
| 0.7194444444444444 | 119.235 |
| 0.720138888888889 | 119.235 |
| 0.7208333333333333 | 119.235 |
| 0.7215277777777778 | 119.235 |
| 0.7222222222222222 | 119.235 |
| 0.7229166666666668 | 119.235 |
| 0.7236111111111111 | 119.235 |
| 0.7243055555555555 | 114.716 |
| 0.725 | 114.716 |
| 0.7256944444444445 | 114.716 |
| 0.7263888888888889 | 114.716 |
| 0.7270833333333333 | 110.201 |
| 0.7277777777777777 | 110.201 |
| 0.7284722222222223 | 110.201 |
| 0.7291666666666666 | 110.201 |
| 0.7298611111111111 | 110.201 |
| 0.7305555555555556 | 110.201 |
| 0.7312500000000001 | 110.201 |
| 0.7319444444444444 | 110.201 |
| 0.7326388888888888 | 110.201 |
| 0.7333333333333334 | 105.69 |
| 0.7340277777777778 | 105.69 |
| 0.7347222222222222 | 105.69 |
| 0.7354166666666666 | 105.69 |
| 0.7361111111111112 | 105.69 |
| 0.7368055555555556 | 105.69 |
| 0.7374999999999999 | 101.184 |
| 0.7381944444444444 | 105.69 |
| 0.7388888888888889 | 101.184 |
| 0.7395833333333334 | 101.184 |
| 0.7402777777777777 | 101.184 |
| 0.7409722222222223 | 101.184 |
| 0.7416666666666667 | 101.184 |
| 0.7423611111111111 | 101.184 |
| 0.7430555555555555 | 101.184 |
| 0.74375 | 101.184 |
| 0.7444444444444445 | 96.682 |
| 0.7451388888888889 | 96.682 |
| 0.7458333333333332 | 96.682 |
| 0.7465277777777778 | 96.682 |
| 0.7472222222222222 | 96.682 |
| 0.7479166666666667 | 96.682 |
| 0.748611111111111 | 96.682 |
| 0.7493055555555556 | 92.184 |
| 0.75 | 92.184 |
| 0.7506944444444444 | 92.184 |
| 0.751388888888889 | 92.184 |
| 0.7520833333333333 | 92.184 |
| 0.7527777777777778 | 92.184 |
| 0.7534722222222222 | 92.184 |
| 0.7541666666666668 | 92.184 |
| 0.7548611111111111 | 92.184 |
| 0.7555555555555555 | 92.184 |
| 0.75625 | 92.184 |
| 0.7569444444444445 | 87.692 |
| 0.7576388888888889 | 87.692 |
| 0.7583333333333333 | 87.692 |
| 0.7590277777777777 | 87.692 |
| 0.7597222222222223 | 87.692 |
| 0.7604166666666666 | 83.205 |
| 0.7611111111111111 | 83.205 |
| 0.7618055555555556 | 83.205 |
| 0.7625000000000001 | 83.205 |
| 0.7631944444444444 | 83.205 |
| 0.7638888888888888 | 83.205 |
| 0.7645833333333334 | 83.205 |
| 0.7652777777777778 | 83.205 |
| 0.7659722222222222 | 78.722 |
| 0.7666666666666666 | 78.722 |
| 0.7673611111111112 | 78.722 |
| 0.7680555555555556 | 78.722 |
| 0.7687499999999999 | 74.246 |
| 0.7694444444444444 | 74.246 |
| 0.7701388888888889 | 74.246 |
| 0.7708333333333334 | 74.246 |
| 0.7715277777777777 | 74.246 |
| 0.7722222222222223 | 74.246 |
| 0.7729166666666667 | 69.775 |
| 0.7736111111111111 | 69.775 |
| 0.7743055555555555 | 69.775 |
| 0.775 | 69.775 |
| 0.7756944444444445 | 65.31 |
| 0.7763888888888889 | 65.31 |
| 0.7770833333333332 | 65.31 |
| 0.7777777777777778 | 65.31 |
| 0.7784722222222222 | 65.31 |
| 0.7791666666666667 | 65.31 |
| 0.779861111111111 | 60.85 |
| 0.7805555555555556 | 60.85 |
| 0.78125 | 60.85 |
| 0.7819444444444444 | 60.85 |
| 0.782638888888889 | 56.398 |
| 0.7833333333333333 | 56.398 |
| 0.7840277777777778 | 56.398 |
| 0.7847222222222222 | 56.398 |
| 0.7854166666666668 | 56.398 |
| 0.7861111111111111 | 51.951 |
| 0.7868055555555555 | 51.951 |
| 0.7875 | 51.951 |
| 0.7881944444444445 | 51.951 |
| 0.7888888888888889 | 51.951 |
| 0.7895833333333333 | 47.511 |
| 0.7902777777777777 | 47.511 |
| 0.7909722222222223 | 47.511 |
| 0.7916666666666666 | 47.511 |
| 0.7923611111111111 | 47.511 |
| 0.7930555555555556 | 47.511 |
| 0.7937500000000001 | 43.079 |
| 0.7944444444444444 | 43.079 |
| 0.7951388888888888 | 43.079 |
| 0.7958333333333334 | 43.079 |
| 0.7965277777777778 | 43.079 |
| 0.7972222222222222 | 38.653 |
| 0.7979166666666666 | 38.653 |
| 0.7986111111111112 | 38.653 |
| 0.7993055555555556 | 38.653 |
| 0.7999999999999999 | 38.653 |
| 0.8006944444444444 | 38.653 |
| 0.8013888888888889 | 38.653 |
| 0.8020833333333334 | 38.653 |
| 0.8027777777777777 | 34.234 |
| 0.8034722222222223 | 34.234 |
| 0.8041666666666667 | 34.234 |
| 0.8048611111111111 | 34.234 |
| 0.8055555555555555 | 34.234 |
| 0.80625 | 34.234 |
| 0.8069444444444445 | 29.823 |
| 0.8076388888888889 | 29.823 |
| 0.8083333333333332 | 29.823 |
| 0.8090277777777778 | 29.823 |
| 0.8097222222222222 | 29.823 |
| 0.8104166666666667 | 29.823 |
| 0.811111111111111 | 29.823 |
| 0.8118055555555556 | 29.823 |
| 0.8125 | 25.419 |
| 0.8131944444444444 | 25.419 |
| 0.813888888888889 | 25.419 |
| 0.8145833333333333 | 25.419 |
| 0.8152777777777778 | 25.419 |
| 0.8159722222222222 | 25.419 |
| 0.8166666666666668 | 25.419 |
| 0.8173611111111111 | 21.024 |
| 0.8180555555555555 | 21.024 |
| 0.81875 | 21.024 |
| 0.8194444444444445 | 21.024 |
| 0.8201388888888889 | 21.024 |
| 0.8208333333333333 | 21.024 |
| 0.8215277777777777 | 21.024 |
| 0.8222222222222223 | 21.024 |
| 0.8229166666666666 | 16.636 |
| 0.8236111111111111 | 16.636 |
| 0.8243055555555556 | 16.636 |
| 0.8250000000000001 | 16.636 |
| 0.8256944444444444 | 16.636 |
| 0.8263888888888888 | 16.636 |
| 0.8270833333333334 | 16.636 |
| 0.8277777777777778 | 12.257 |
| 0.8284722222222222 | 12.257 |
| 0.8291666666666666 | 12.257 |
| 0.8298611111111112 | 12.257 |
| 0.8305555555555556 | 12.257 |
| 0.8312499999999999 | 12.257 |
| 0.8319444444444444 | 7.887 |
| 0.8326388888888889 | 7.887 |
| 0.8333333333333334 | 7.887 |
| 0.8340277777777777 | 7.887 |
| 0.8347222222222223 | 7.887 |
| 0.8354166666666667 | 7.887 |
| 0.8361111111111111 | 7.887 |
| 0.8368055555555555 | 3.525 |
| 0.8375 | 3.525 |
| 0.8381944444444445 | 3.525 |
| 0.8388888888888889 | 3.525 |
| 0.8395833333333332 | 3.525 |
| 0.8402777777777778 | 3.525 |
| 0.8409722222222222 | 3.525 |
| 0.8416666666666667 | 3.525 |
| 0.842361111111111 | 3.525 |
| 0.8430555555555556 | 3.525 |
| 0.84375 | 0 |
| 0.8444444444444444 | 0 |
| 0.845138888888889 | 0 |
| 0.8458333333333333 | 0 |
| 0.8465277777777778 | 0 |
| 0.8472222222222222 | 0 |
| 0.8479166666666668 | 0 |
| 0.8486111111111111 | 0 |
| 0.8493055555555555 | 0 |
| 0.85 | 0 |
| 0.8506944444444445 | 0 |
| 0.8513888888888889 | 0 |
| 0.8520833333333333 | 0 |
| 0.8527777777777777 | 0 |
| 0.8534722222222223 | 0 |
| 0.8541666666666666 | 0 |
| 0.8548611111111111 | 0 |
| 0.8555555555555556 | 0 |
| 0.8562500000000001 | 0 |
| 0.8569444444444444 | 0 |
| 0.8576388888888888 | 0 |
| 0.8583333333333334 | 0 |
| 0.8590277777777778 | 0 |
| 0.8597222222222222 | 0 |
| 0.8604166666666666 | 0 |
| 0.8611111111111112 | 0 |
| 0.8618055555555556 | 0 |
| 0.8624999999999999 | 0 |
| 0.8631944444444444 | 0 |
| 0.8638888888888889 | 0 |
| 0.8645833333333334 | 0 |
| 0.8652777777777777 | 0 |
| 0.8659722222222223 | 0 |
| 0.8666666666666667 | 0 |
| 0.8673611111111111 | 0 |
| 0.8680555555555555 | 0 |
| 0.86875 | 0 |
| 0.8694444444444445 | 0 |
| 0.8701388888888889 | 0 |
| 0.8708333333333332 | 0 |
| 0.8715277777777778 | 0 |
| 0.8722222222222222 | 0 |
| 0.8729166666666667 | 0 |
| 0.873611111111111 | 0 |
| 0.8743055555555556 | 0 |
| 0.875 | 0 |
| 0.8756944444444444 | 0 |
| 0.876388888888889 | 0 |
| 0.8770833333333333 | 0 |
| 0.8777777777777778 | 0 |
| 0.8784722222222222 | 0 |
| 0.8791666666666668 | 0 |
| 0.8798611111111111 | 0 |
| 0.8805555555555555 | 0 |
| 0.88125 | 0 |
| 0.8819444444444445 | 0 |
| 0.8826388888888889 | 0 |
| 0.8833333333333333 | 0 |
| 0.8840277777777777 | 0 |
| 0.8847222222222223 | 0 |
| 0.8854166666666666 | 0 |
| 0.8861111111111111 | 0 |
| 0.8868055555555556 | 0 |
| 0.8875000000000001 | 0 |
| 0.8881944444444444 | 0 |
| 0.8888888888888888 | 0 |
| 0.8895833333333334 | 0 |
| 0.8902777777777778 | 0 |
| 0.8909722222222222 | 0 |
| 0.8916666666666666 | 0 |
| 0.8923611111111112 | 0 |
| 0.8930555555555556 | 0 |
| 0.8937499999999999 | 0 |
| 0.8944444444444444 | 0 |
| 0.8951388888888889 | 0 |
| 0.8958333333333334 | 0 |
| 0.8965277777777777 | 0 |
| 0.8972222222222223 | 0 |
| 0.8979166666666667 | 0 |
| 0.8986111111111111 | 0 |
| 0.8993055555555555 | 0 |
| 0.9 | 0 |
| 0.9006944444444445 | 0 |
| 0.9013888888888889 | 0 |
| 0.9020833333333332 | 0 |
| 0.9027777777777778 | 0 |
| 0.9034722222222222 | 0 |
| 0.9041666666666667 | 0 |
| 0.904861111111111 | 0 |
| 0.9055555555555556 | 0 |
| 0.90625 | 0 |
| 0.9069444444444444 | 0 |
| 0.907638888888889 | 0 |
| 0.9083333333333333 | 0 |
| 0.9090277777777778 | 0 |
| 0.9097222222222222 | 0 |
| 0.9104166666666668 | 0 |
| 0.9111111111111111 | 0 |
| 0.9118055555555555 | 0 |
| 0.9125 | 0 |
| 0.9131944444444445 | 0 |
| 0.9138888888888889 | 0 |
| 0.9145833333333333 | 0 |
| 0.9152777777777777 | 0 |
| 0.9159722222222223 | 0 |
| 0.9166666666666666 | 0 |
| 0.9173611111111111 | 0 |
| 0.9180555555555556 | 0 |
| 0.9187500000000001 | 0 |
| 0.9194444444444444 | 0 |
| 0.9201388888888888 | 0 |
| 0.9208333333333334 | 0 |
| 0.9215277777777778 | 0 |
| 0.9222222222222222 | 0 |
| 0.9229166666666666 | 0 |
| 0.9236111111111112 | 0 |
| 0.9243055555555556 | 0 |
| 0.9249999999999999 | 0 |
| 0.9256944444444444 | 0 |
| 0.9263888888888889 | 0 |
| 0.9270833333333334 | 0 |
| 0.9277777777777777 | 0 |
| 0.9284722222222223 | 0 |
| 0.9291666666666667 | 0 |
| 0.9298611111111111 | 0 |
| 0.9305555555555555 | 0 |
| 0.93125 | 0 |
| 0.9319444444444445 | 0 |
| 0.9326388888888889 | 0 |
| 0.9333333333333332 | 0 |
| 0.9340277777777778 | 0 |
| 0.9347222222222222 | 0 |
| 0.9354166666666667 | 0 |
| 0.936111111111111 | 0 |
| 0.9368055555555556 | 0 |
| 0.9375 | 0 |
| 0.9381944444444444 | 0 |
| 0.938888888888889 | 0 |
| 0.9395833333333333 | 0 |
| 0.9402777777777778 | 0 |
| 0.9409722222222222 | 0 |
| 0.9416666666666668 | 0 |
| 0.9423611111111111 | 0 |
| 0.9430555555555555 | 0 |
| 0.94375 | 0 |
| 0.9444444444444445 | 0 |
| 0.9451388888888889 | 0 |
| 0.9458333333333333 | 0 |
| 0.9465277777777777 | 0 |
| 0.9472222222222223 | 0 |
| 0.9479166666666666 | 0 |
| 0.9486111111111111 | 0 |
| 0.9493055555555556 | 0 |
| 0.9500000000000001 | 0 |
| 0.9506944444444444 | 0 |
| 0.9513888888888888 | 0 |
| 0.9520833333333334 | 0 |
| 0.9527777777777778 | 0 |
| 0.9534722222222222 | 0 |
| 0.9541666666666666 | 0 |
| 0.9548611111111112 | 0 |
| 0.9555555555555556 | 0 |
| 0.9562499999999999 | 0 |
| 0.9569444444444444 | 0 |
| 0.9576388888888889 | 0 |
| 0.9583333333333334 | 0 |
| 0.9590277777777777 | 0 |
| 0.9597222222222223 | 0 |
| 0.9604166666666667 | 0 |
| 0.9611111111111111 | 0 |
| 0.9618055555555555 | 0 |
| 0.9625 | 0 |
| 0.9631944444444445 | 0 |
| 0.9638888888888889 | 0 |
| 0.9645833333333332 | 0 |
| 0.9652777777777778 | 0 |
| 0.9659722222222222 | 0 |
| 0.9666666666666667 | 0 |
| 0.967361111111111 | 0 |
| 0.9680555555555556 | 0 |
| 0.96875 | 0 |
| 0.9694444444444444 | 0 |
| 0.970138888888889 | 0 |
| 0.9708333333333333 | 0 |
| 0.9715277777777778 | 0 |
| 0.9722222222222222 | 0 |
| 0.9729166666666668 | 0 |
| 0.9736111111111111 | 0 |
| 0.9743055555555555 | 0 |
| 0.975 | 0 |
| 0.9756944444444445 | 0 |
| 0.9763888888888889 | 0 |
| 0.9770833333333333 | 0 |
| 0.9777777777777777 | 0 |
| 0.9784722222222223 | 0 |
| 0.9791666666666666 | 0 |
| 0.9798611111111111 | 0 |
| 0.9805555555555556 | 0 |
| 0.9812500000000001 | 0 |
| 0.9819444444444444 | 0 |
| 0.9826388888888888 | 0 |
| 0.9833333333333334 | 0 |
| 0.9840277777777778 | 0 |
| 0.9847222222222222 | 0 |
| 0.9854166666666666 | 0 |
| 0.9861111111111112 | 0 |
| 0.9868055555555556 | 0 |
| 0.9874999999999999 | 0 |
| 0.9881944444444444 | 0 |
| 0.9888888888888889 | 0 |
| 0.9895833333333334 | 0 |
| 0.9902777777777777 | 0 |
| 0.9909722222222223 | 0 |
| 0.9916666666666667 | 0 |
| 0.9923611111111111 | 0 |
| 0.9930555555555555 | 0 |
| 0.99375 | 0 |
| 0.9944444444444445 | 0 |
| 0.9951388888888889 | 0 |
| 0.9958333333333332 | 0 |
| 0.9965277777777778 | 0 |
| 0.9972222222222222 | 0 |
| 0.9979166666666667 | 0 |
| 0.998611111111111 | 0 |
| 0.9993055555555556 | 0 |